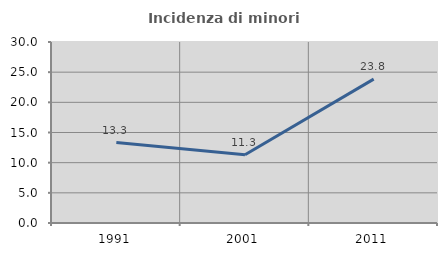
| Category | Incidenza di minori stranieri |
|---|---|
| 1991.0 | 13.333 |
| 2001.0 | 11.321 |
| 2011.0 | 23.846 |